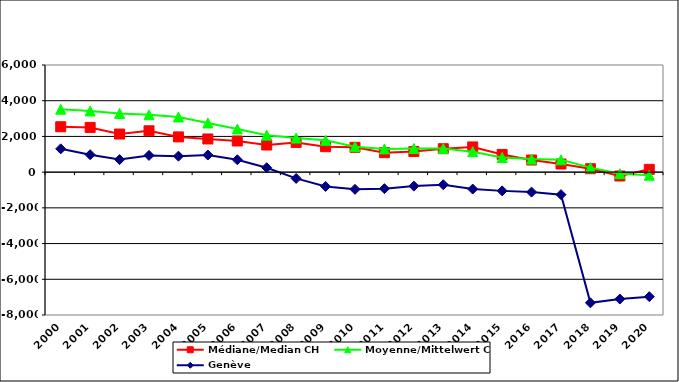
| Category | Médiane/Median CH | Moyenne/Mittelwert CH | Genève |
|---|---|---|---|
| 2000.0 | 2542 | 3524.64 | 1305 |
| 2001.0 | 2505 | 3428.8 | 977 |
| 2002.0 | 2134 | 3290.4 | 703 |
| 2003.0 | 2316 | 3215.6 | 937 |
| 2004.0 | 1974 | 3090.325 | 895 |
| 2005.0 | 1858 | 2756.351 | 958 |
| 2006.0 | 1744.5 | 2416.426 | 694 |
| 2007.0 | 1520 | 2070.521 | 247 |
| 2008.0 | 1660 | 1907.634 | -351 |
| 2009.0 | 1426 | 1780.53 | -801.9 |
| 2010.0 | 1388.8 | 1427.327 | -963.2 |
| 2011.0 | 1091 | 1302.405 | -925.9 |
| 2012.0 | 1157.645 | 1326.071 | -780.6 |
| 2013.0 | 1313 | 1328.597 | -705.74 |
| 2014.0 | 1412.435 | 1147.291 | -947 |
| 2015.0 | 992 | 819.292 | -1049 |
| 2016.0 | 679 | 729.357 | -1118 |
| 2017.0 | 456.291 | 689.633 | -1260 |
| 2018.0 | 191 | 252.883 | -7317.9 |
| 2019.0 | -215 | -84.065 | -7107 |
| 2020.0 | 157 | -172.236 | -6973 |